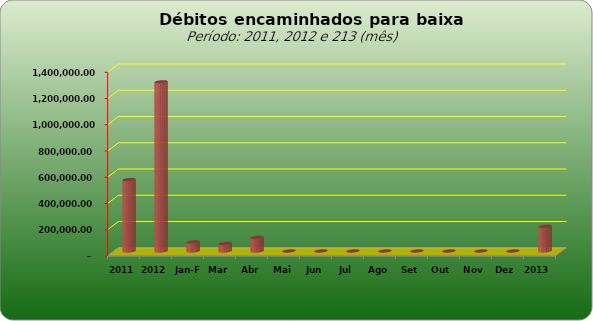
| Category |  543.796,20   1.288.982,12   68.983,48   57.649,63   103.629,52   -     -     -     -     -     -     -     -     188.071,98  |
|---|---|
| 2011 | 543796.2 |
| 2012 | 1288982.12 |
| Jan-Fev | 68983.48 |
| Mar | 57649.63 |
| Abr | 103629.52 |
| Mai | 0 |
| Jun | 0 |
| Jul | 0 |
| Ago | 0 |
| Set | 0 |
| Out | 0 |
| Nov | 0 |
| Dez | 0 |
| 2013 | 188071.98 |